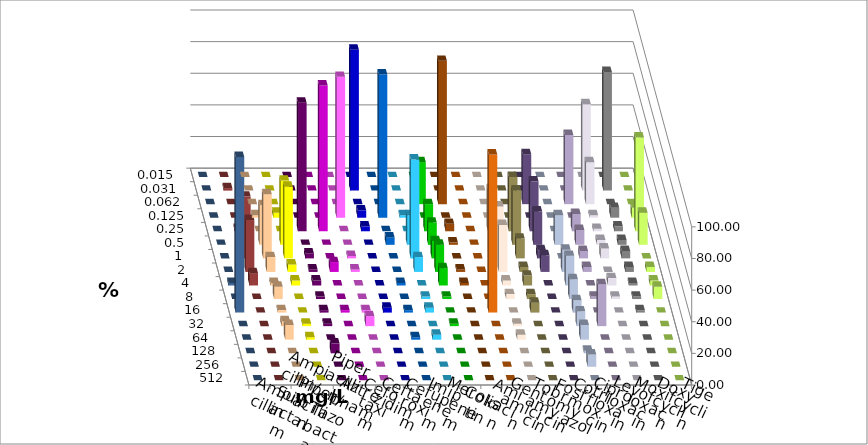
| Category | Ampicillin | Ampicillin/ Sulbactam | Piperacillin | Piperacillin/ Tazobactam | Aztreonam | Cefotaxim | Ceftazidim | Cefuroxim | Imipenem | Meropenem | Colistin | Amikacin | Gentamicin | Tobramycin | Fosfomycin | Cotrimoxazol | Ciprofloxacin | Levofloxacin | Moxifloxacin | Doxycyclin | Tigecyclin |
|---|---|---|---|---|---|---|---|---|---|---|---|---|---|---|---|---|---|---|---|---|---|
| 0.015 | 0 | 0 | 0 | 0 | 0 | 0 | 0 | 0 | 0 | 0 | 0 | 0 | 0 | 0 | 0 | 0 | 0 | 0 | 0 | 0 | 0 |
| 0.031 | 0 | 0 | 0 | 0 | 0 | 89.062 | 0 | 0 | 0 | 0 | 0 | 0 | 0 | 0 | 0 | 0 | 54.688 | 75 | 0 | 0 | 1.562 |
| 0.062 | 0 | 0 | 0 | 0 | 0 | 0 | 0 | 0 | 26.562 | 90.625 | 0 | 0 | 0 | 31.579 | 0 | 43.75 | 26.562 | 0 | 0 | 0 | 0 |
| 0.125 | 1.562 | 3.125 | 0 | 0 | 89.062 | 4.688 | 90.625 | 1.562 | 0 | 0 | 0 | 0 | 0 | 0 | 0 | 0 | 1.562 | 6.25 | 6.25 | 0 | 0 |
| 0.25 | 0 | 0 | 81.25 | 92.188 | 0 | 3.125 | 0 | 0 | 17.188 | 4.688 | 0 | 26.562 | 34.375 | 31.579 | 0 | 10.938 | 1.562 | 3.125 | 59.375 | 0 | 1.562 |
| 0.5 | 25 | 40.625 | 0 | 0 | 0 | 0 | 4.688 | 18.75 | 14.062 | 1.562 | 0 | 0 | 34.375 | 21.053 | 18.75 | 9.375 | 3.125 | 3.125 | 20.312 | 0 | 17.188 |
| 1.0 | 40.625 | 45.312 | 3.125 | 0 | 1.562 | 0 | 0 | 62.5 | 10.938 | 0 | 0 | 32.812 | 12.5 | 5.263 | 0 | 4.688 | 6.25 | 4.688 | 0 | 0 | 39.062 |
| 2.0 | 9.375 | 4.688 | 1.562 | 6.25 | 1.562 | 0 | 0 | 9.375 | 17.188 | 1.562 | 0 | 29.688 | 3.125 | 10.526 | 14.062 | 3.125 | 0 | 3.125 | 3.125 | 0 | 32.812 |
| 4.0 | 1.562 | 3.125 | 3.125 | 0 | 0 | 0 | 1.562 | 0 | 10.938 | 1.562 | 0 | 3.125 | 6.25 | 0 | 18.75 | 0 | 4.688 | 1.562 | 3.125 | 1.562 | 7.812 |
| 8.0 | 7.812 | 0 | 1.562 | 0 | 0 | 0 | 0 | 1.562 | 1.562 | 0 | 0 | 3.125 | 3.125 | 0 | 12.5 | 1.562 | 1.562 | 1.562 | 7.812 | 0 | 0 |
| 16.0 | 1.562 | 0 | 1.562 | 1.562 | 1.562 | 3.125 | 1.562 | 3.125 | 0 | 0 | 100 | 0 | 6.25 | 0 | 7.812 | 0 | 0 | 1.562 | 0 | 98.438 | 0 |
| 32.0 | 3.125 | 1.562 | 1.562 | 0 | 6.25 | 0 | 0 | 0 | 1.562 | 0 | 0 | 1.562 | 0 | 0 | 9.375 | 26.562 | 0 | 0 | 0 | 0 | 0 |
| 64.0 | 9.375 | 1.562 | 0 | 0 | 0 | 0 | 1.562 | 3.125 | 0 | 0 | 0 | 3.125 | 0 | 0 | 9.375 | 0 | 0 | 0 | 0 | 0 | 0 |
| 128.0 | 0 | 0 | 6.25 | 0 | 0 | 0 | 0 | 0 | 0 | 0 | 0 | 0 | 0 | 0 | 1.562 | 0 | 0 | 0 | 0 | 0 | 0 |
| 256.0 | 0 | 0 | 0 | 0 | 0 | 0 | 0 | 0 | 0 | 0 | 0 | 0 | 0 | 0 | 7.812 | 0 | 0 | 0 | 0 | 0 | 0 |
| 512.0 | 0 | 0 | 0 | 0 | 0 | 0 | 0 | 0 | 0 | 0 | 0 | 0 | 0 | 0 | 0 | 0 | 0 | 0 | 0 | 0 | 0 |